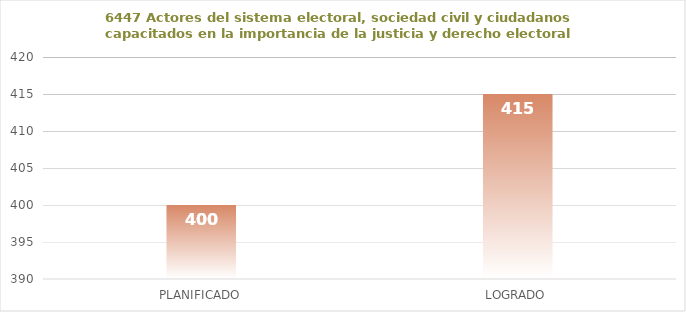
| Category | 6447 |
|---|---|
| PLANIFICADO | 400 |
| LOGRADO | 415 |